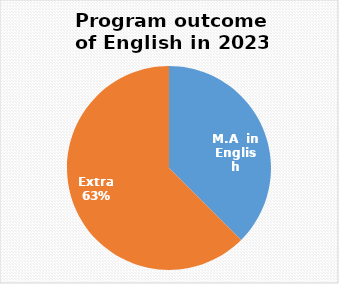
| Category | Series 0 |
|---|---|
| M.A  in English | 21 |
| Extra | 35 |